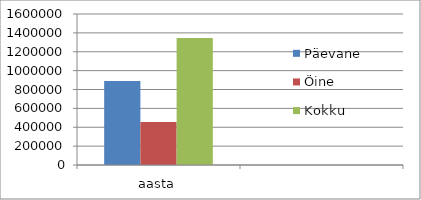
| Category | Päevane | Öine | Kokku |
|---|---|---|---|
| aasta | 890118.7 | 455199.4 | 1345318.1 |